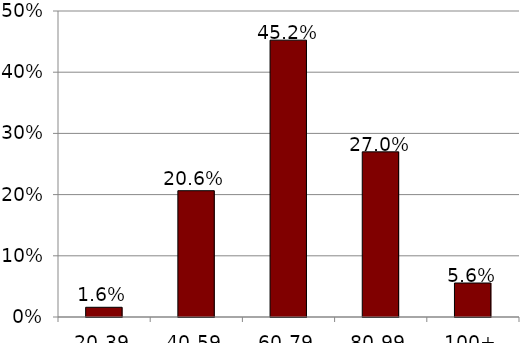
| Category | Series 1 |
|---|---|
| 20-39 | 0.016 |
| 40-59 | 0.206 |
| 60-79 | 0.452 |
| 80-99 | 0.27 |
| 100+ | 0.056 |